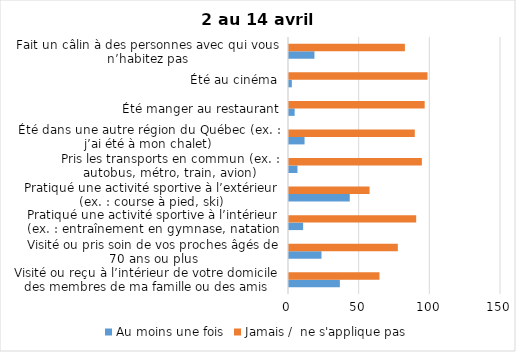
| Category | Au moins une fois | Jamais /  ne s'applique pas |
|---|---|---|
| Visité ou reçu à l’intérieur de votre domicile des membres de ma famille ou des amis | 36 | 64 |
| Visité ou pris soin de vos proches âgés de 70 ans ou plus | 23 | 77 |
| Pratiqué une activité sportive à l’intérieur (ex. : entraînement en gymnase, natation en piscine) | 10 | 90 |
| Pratiqué une activité sportive à l’extérieur (ex. : course à pied, ski) | 43 | 57 |
| Pris les transports en commun (ex. : autobus, métro, train, avion) | 6 | 94 |
| Été dans une autre région du Québec (ex. : j’ai été à mon chalet) | 11 | 89 |
| Été manger au restaurant | 4 | 96 |
| Été au cinéma | 2 | 98 |
| Fait un câlin à des personnes avec qui vous n’habitez pas | 18 | 82 |